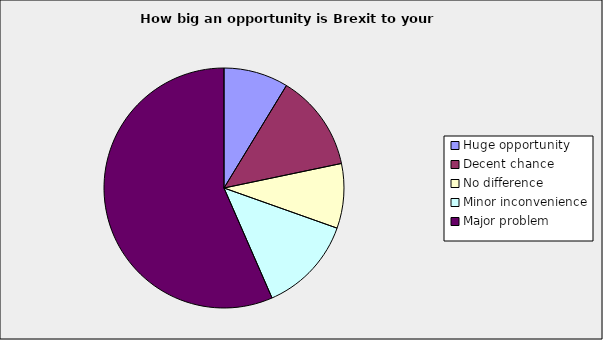
| Category | Series 0 |
|---|---|
| Huge opportunity | 0.087 |
| Decent‎ chance | 0.13 |
| No difference | 0.087 |
| Minor inconvenience | 0.13 |
| Major problem | 0.565 |